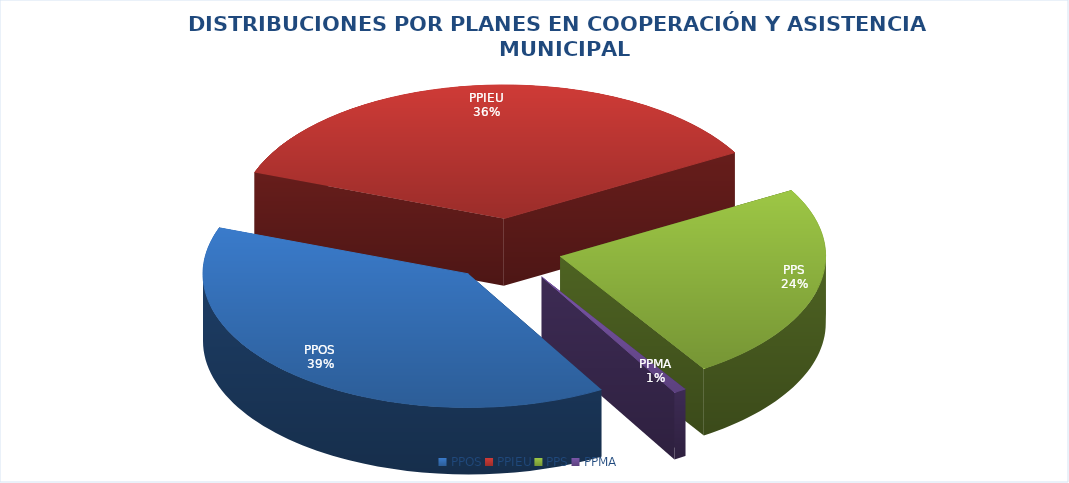
| Category | Series 0 |
|---|---|
| PPOS | 33026629.49 |
| PPIEU | 30686342.26 |
| PPS | 20468844.46 |
| PPMA | 645480.66 |